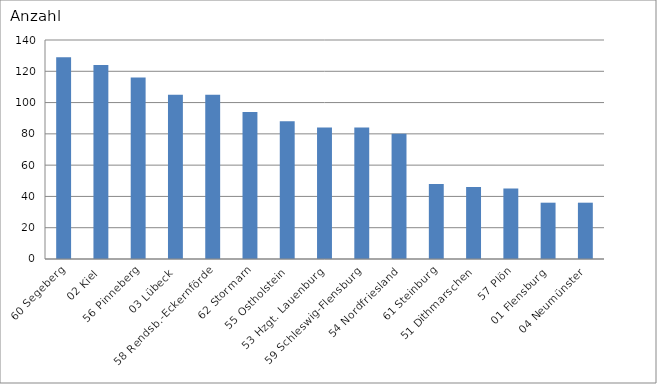
| Category | 60 Segeberg 02 Kiel 56 Pinneberg 03 Lübeck 58 Rendsb.-Eckernförde 62 Stormarn 55 Ostholstein 53 Hzgt. Lauenburg 59 Schleswig-Flensburg 54 Nordfriesland 61 Steinburg 51 Dithmarschen 57 Plön 01 Flensburg 04 Neumünster |
|---|---|
| 60 Segeberg | 129 |
| 02 Kiel | 124 |
| 56 Pinneberg | 116 |
| 03 Lübeck | 105 |
| 58 Rendsb.-Eckernförde | 105 |
| 62 Stormarn | 94 |
| 55 Ostholstein | 88 |
| 53 Hzgt. Lauenburg | 84 |
| 59 Schleswig-Flensburg | 84 |
| 54 Nordfriesland | 80 |
| 61 Steinburg | 48 |
| 51 Dithmarschen | 46 |
| 57 Plön | 45 |
| 01 Flensburg | 36 |
| 04 Neumünster | 36 |